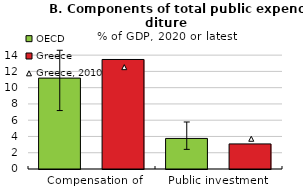
| Category | OECD | Greece |
|---|---|---|
| Compensation of employees | 11.175 | 13.465 |
| Public investment | 3.759 | 3.084 |